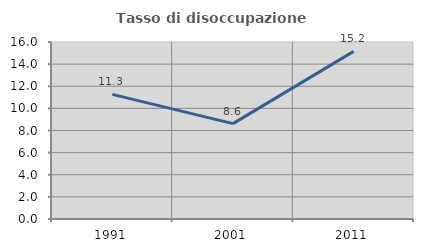
| Category | Tasso di disoccupazione giovanile  |
|---|---|
| 1991.0 | 11.268 |
| 2001.0 | 8.621 |
| 2011.0 | 15.152 |